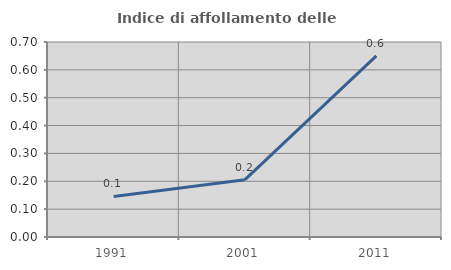
| Category | Indice di affollamento delle abitazioni  |
|---|---|
| 1991.0 | 0.146 |
| 2001.0 | 0.206 |
| 2011.0 | 0.65 |